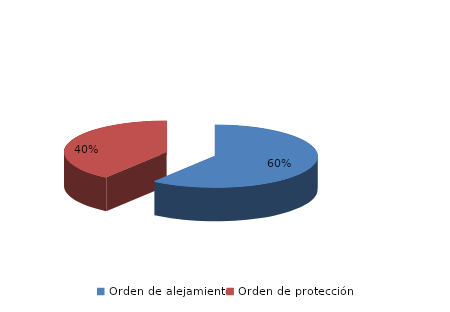
| Category | Series 0 |
|---|---|
| Orden de alejamiento | 9 |
| Orden de protección | 6 |